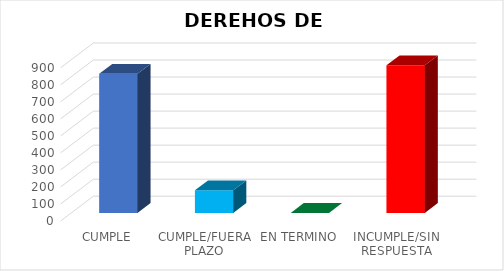
| Category | Series 0 |
|---|---|
| CUMPLE | 817 |
| CUMPLE/FUERA PLAZO | 133 |
| EN TERMINO | 0 |
| INCUMPLE/SIN RESPUESTA | 867 |